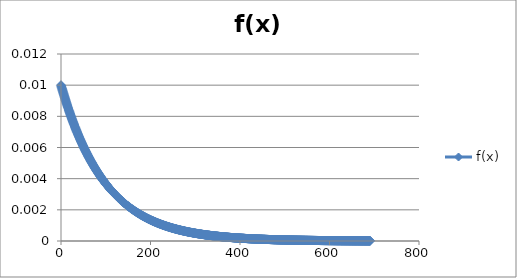
| Category | f(x) |
|---|---|
| 1e-10 | 0.01 |
| 0.6907755279981135 | 0.01 |
| 1.381551055896227 | 0.01 |
| 2.0723265837943403 | 0.01 |
| 2.763102111692454 | 0.01 |
| 3.4538776395905675 | 0.01 |
| 4.144653167488681 | 0.01 |
| 4.835428695386794 | 0.01 |
| 5.526204223284907 | 0.009 |
| 6.21697975118302 | 0.009 |
| 6.907755279081133 | 0.009 |
| 7.598530806979246 | 0.009 |
| 8.28930633487736 | 0.009 |
| 8.980081862775473 | 0.009 |
| 9.670857390673586 | 0.009 |
| 10.361632918571699 | 0.009 |
| 11.052408446469812 | 0.009 |
| 11.743183974367925 | 0.009 |
| 12.433959502266038 | 0.009 |
| 13.124735030164151 | 0.009 |
| 13.815510558062265 | 0.009 |
| 14.506286085960378 | 0.009 |
| 15.19706161385849 | 0.009 |
| 15.887837141756604 | 0.009 |
| 16.578612669654717 | 0.008 |
| 17.269388197552832 | 0.008 |
| 17.960163725450947 | 0.008 |
| 18.650939253349062 | 0.008 |
| 19.341714781247177 | 0.008 |
| 20.03249030914529 | 0.008 |
| 20.723265837043407 | 0.008 |
| 21.41404136494152 | 0.008 |
| 22.104816892839636 | 0.008 |
| 22.79559242073775 | 0.008 |
| 23.486367948635866 | 0.008 |
| 24.17714347653398 | 0.008 |
| 24.867919004432096 | 0.008 |
| 25.55869453233021 | 0.008 |
| 26.249470060228326 | 0.008 |
| 26.94024558812644 | 0.008 |
| 27.631021116024556 | 0.008 |
| 28.32179664392267 | 0.008 |
| 29.012572171820786 | 0.007 |
| 29.7033476997189 | 0.007 |
| 30.394123227617015 | 0.007 |
| 31.08489875551513 | 0.007 |
| 31.775674283413245 | 0.007 |
| 32.46644981131136 | 0.007 |
| 33.15722533920947 | 0.007 |
| 33.84800086710758 | 0.007 |
| 34.53877639500569 | 0.007 |
| 35.2295519229038 | 0.007 |
| 35.92032745080191 | 0.007 |
| 36.611102978700025 | 0.007 |
| 37.301878506598136 | 0.007 |
| 37.99265403449625 | 0.007 |
| 38.68342956239436 | 0.007 |
| 39.37420509029247 | 0.007 |
| 40.06498061819058 | 0.007 |
| 40.75575614608869 | 0.007 |
| 41.446531673986804 | 0.007 |
| 42.137307201884916 | 0.007 |
| 42.82808272978303 | 0.007 |
| 43.51885825768114 | 0.006 |
| 44.20963378557925 | 0.006 |
| 44.90040931347736 | 0.006 |
| 45.59118484137547 | 0.006 |
| 46.281960369273584 | 0.006 |
| 46.972735897171695 | 0.006 |
| 47.66351142506981 | 0.006 |
| 48.35428695296792 | 0.006 |
| 49.04506248086603 | 0.006 |
| 49.73583800876414 | 0.006 |
| 50.42661353666225 | 0.006 |
| 51.11738906456036 | 0.006 |
| 51.808164592458475 | 0.006 |
| 52.498940120356586 | 0.006 |
| 53.1897156482547 | 0.006 |
| 53.88049117615281 | 0.006 |
| 54.57126670405092 | 0.006 |
| 55.26204223194903 | 0.006 |
| 55.95281775984714 | 0.006 |
| 56.643593287745254 | 0.006 |
| 57.334368815643366 | 0.006 |
| 58.02514434354148 | 0.006 |
| 58.71591987143959 | 0.006 |
| 59.4066953993377 | 0.006 |
| 60.09747092723581 | 0.005 |
| 60.78824645513392 | 0.005 |
| 61.479021983032034 | 0.005 |
| 62.169797510930145 | 0.005 |
| 62.86057303882826 | 0.005 |
| 63.55134856672637 | 0.005 |
| 64.24212409462449 | 0.005 |
| 64.9328996225226 | 0.005 |
| 65.62367515042071 | 0.005 |
| 66.31445067831882 | 0.005 |
| 67.00522620621693 | 0.005 |
| 67.69600173411504 | 0.005 |
| 68.38677726201315 | 0.005 |
| 69.07755278991127 | 0.005 |
| 69.76832831780938 | 0.005 |
| 70.45910384570749 | 0.005 |
| 71.1498793736056 | 0.005 |
| 71.84065490150371 | 0.005 |
| 72.53143042940182 | 0.005 |
| 73.22220595729993 | 0.005 |
| 73.91298148519805 | 0.005 |
| 74.60375701309616 | 0.005 |
| 75.29453254099427 | 0.005 |
| 75.98530806889238 | 0.005 |
| 76.67608359679049 | 0.005 |
| 77.3668591246886 | 0.005 |
| 78.05763465258671 | 0.005 |
| 78.74841018048483 | 0.005 |
| 79.43918570838294 | 0.005 |
| 80.12996123628105 | 0.004 |
| 80.82073676417916 | 0.004 |
| 81.51151229207727 | 0.004 |
| 82.20228781997538 | 0.004 |
| 82.8930633478735 | 0.004 |
| 83.5838388757716 | 0.004 |
| 84.27461440366972 | 0.004 |
| 84.96538993156783 | 0.004 |
| 85.65616545946594 | 0.004 |
| 86.34694098736405 | 0.004 |
| 87.03771651526216 | 0.004 |
| 87.72849204316027 | 0.004 |
| 88.41926757105838 | 0.004 |
| 89.1100430989565 | 0.004 |
| 89.8008186268546 | 0.004 |
| 90.49159415475272 | 0.004 |
| 91.18236968265083 | 0.004 |
| 91.87314521054894 | 0.004 |
| 92.56392073844705 | 0.004 |
| 93.25469626634516 | 0.004 |
| 93.94547179424328 | 0.004 |
| 94.63624732214139 | 0.004 |
| 95.3270228500395 | 0.004 |
| 96.01779837793761 | 0.004 |
| 96.70857390583572 | 0.004 |
| 97.39934943373383 | 0.004 |
| 98.09012496163194 | 0.004 |
| 98.78090048953005 | 0.004 |
| 99.47167601742817 | 0.004 |
| 100.16245154532628 | 0.004 |
| 100.85322707322439 | 0.004 |
| 101.5440026011225 | 0.004 |
| 102.23477812902061 | 0.004 |
| 102.92555365691872 | 0.004 |
| 103.61632918481683 | 0.004 |
| 104.30710471271495 | 0.004 |
| 104.99788024061306 | 0.003 |
| 105.68865576851117 | 0.003 |
| 106.37943129640928 | 0.003 |
| 107.07020682430739 | 0.003 |
| 107.7609823522055 | 0.003 |
| 108.45175788010361 | 0.003 |
| 109.14253340800173 | 0.003 |
| 109.83330893589984 | 0.003 |
| 110.52408446379795 | 0.003 |
| 111.21485999169606 | 0.003 |
| 111.90563551959417 | 0.003 |
| 112.59641104749228 | 0.003 |
| 113.2871865753904 | 0.003 |
| 113.9779621032885 | 0.003 |
| 114.66873763118662 | 0.003 |
| 115.35951315908473 | 0.003 |
| 116.05028868698284 | 0.003 |
| 116.74106421488095 | 0.003 |
| 117.43183974277906 | 0.003 |
| 118.12261527067717 | 0.003 |
| 118.81339079857528 | 0.003 |
| 119.5041663264734 | 0.003 |
| 120.1949418543715 | 0.003 |
| 120.88571738226962 | 0.003 |
| 121.57649291016773 | 0.003 |
| 122.26726843806584 | 0.003 |
| 122.95804396596395 | 0.003 |
| 123.64881949386206 | 0.003 |
| 124.33959502176018 | 0.003 |
| 125.03037054965829 | 0.003 |
| 125.7211460775564 | 0.003 |
| 126.41192160545451 | 0.003 |
| 127.10269713335262 | 0.003 |
| 127.79347266125073 | 0.003 |
| 128.48424818914884 | 0.003 |
| 129.17502371704697 | 0.003 |
| 129.8657992449451 | 0.003 |
| 130.55657477284322 | 0.003 |
| 131.24735030074135 | 0.003 |
| 131.93812582863947 | 0.003 |
| 132.6289013565376 | 0.003 |
| 133.31967688443572 | 0.003 |
| 134.01045241233385 | 0.003 |
| 134.70122794023197 | 0.003 |
| 135.3920034681301 | 0.003 |
| 136.08277899602822 | 0.003 |
| 136.77355452392635 | 0.003 |
| 137.46433005182448 | 0.003 |
| 138.1551055797226 | 0.003 |
| 138.84588110762073 | 0.002 |
| 139.53665663551885 | 0.002 |
| 140.22743216341698 | 0.002 |
| 140.9182076913151 | 0.002 |
| 141.60898321921323 | 0.002 |
| 142.29975874711135 | 0.002 |
| 142.99053427500948 | 0.002 |
| 143.6813098029076 | 0.002 |
| 144.37208533080573 | 0.002 |
| 145.06286085870386 | 0.002 |
| 145.75363638660198 | 0.002 |
| 146.4444119145001 | 0.002 |
| 147.13518744239823 | 0.002 |
| 147.82596297029636 | 0.002 |
| 148.51673849819448 | 0.002 |
| 149.2075140260926 | 0.002 |
| 149.89828955399074 | 0.002 |
| 150.58906508188886 | 0.002 |
| 151.279840609787 | 0.002 |
| 151.9706161376851 | 0.002 |
| 152.66139166558324 | 0.002 |
| 153.35216719348136 | 0.002 |
| 154.0429427213795 | 0.002 |
| 154.73371824927762 | 0.002 |
| 155.42449377717574 | 0.002 |
| 156.11526930507387 | 0.002 |
| 156.806044832972 | 0.002 |
| 157.49682036087012 | 0.002 |
| 158.18759588876824 | 0.002 |
| 158.87837141666637 | 0.002 |
| 159.5691469445645 | 0.002 |
| 160.25992247246262 | 0.002 |
| 160.95069800036075 | 0.002 |
| 161.64147352825887 | 0.002 |
| 162.332249056157 | 0.002 |
| 163.02302458405512 | 0.002 |
| 163.71380011195325 | 0.002 |
| 164.40457563985137 | 0.002 |
| 165.0953511677495 | 0.002 |
| 165.78612669564762 | 0.002 |
| 166.47690222354575 | 0.002 |
| 167.16767775144388 | 0.002 |
| 167.858453279342 | 0.002 |
| 168.54922880724013 | 0.002 |
| 169.24000433513825 | 0.002 |
| 169.93077986303638 | 0.002 |
| 170.6215553909345 | 0.002 |
| 171.31233091883263 | 0.002 |
| 172.00310644673075 | 0.002 |
| 172.69388197462888 | 0.002 |
| 173.384657502527 | 0.002 |
| 174.07543303042513 | 0.002 |
| 174.76620855832326 | 0.002 |
| 175.45698408622138 | 0.002 |
| 176.1477596141195 | 0.002 |
| 176.83853514201763 | 0.002 |
| 177.52931066991576 | 0.002 |
| 178.22008619781388 | 0.002 |
| 178.910861725712 | 0.002 |
| 179.60163725361014 | 0.002 |
| 180.29241278150826 | 0.002 |
| 180.9831883094064 | 0.002 |
| 181.6739638373045 | 0.002 |
| 182.36473936520264 | 0.002 |
| 183.05551489310076 | 0.002 |
| 183.7462904209989 | 0.002 |
| 184.43706594889701 | 0.002 |
| 185.12784147679514 | 0.002 |
| 185.81861700469327 | 0.002 |
| 186.5093925325914 | 0.002 |
| 187.20016806048952 | 0.002 |
| 187.89094358838764 | 0.002 |
| 188.58171911628577 | 0.002 |
| 189.2724946441839 | 0.002 |
| 189.96327017208202 | 0.001 |
| 190.65404569998014 | 0.001 |
| 191.34482122787827 | 0.001 |
| 192.0355967557764 | 0.001 |
| 192.72637228367452 | 0.001 |
| 193.41714781157265 | 0.001 |
| 194.10792333947077 | 0.001 |
| 194.7986988673689 | 0.001 |
| 195.48947439526702 | 0.001 |
| 196.18024992316515 | 0.001 |
| 196.87102545106328 | 0.001 |
| 197.5618009789614 | 0.001 |
| 198.25257650685953 | 0.001 |
| 198.94335203475765 | 0.001 |
| 199.63412756265578 | 0.001 |
| 200.3249030905539 | 0.001 |
| 201.01567861845203 | 0.001 |
| 201.70645414635015 | 0.001 |
| 202.39722967424828 | 0.001 |
| 203.0880052021464 | 0.001 |
| 203.77878073004453 | 0.001 |
| 204.46955625794266 | 0.001 |
| 205.16033178584078 | 0.001 |
| 205.8511073137389 | 0.001 |
| 206.54188284163703 | 0.001 |
| 207.23265836953516 | 0.001 |
| 207.92343389743328 | 0.001 |
| 208.6142094253314 | 0.001 |
| 209.30498495322954 | 0.001 |
| 209.99576048112766 | 0.001 |
| 210.6865360090258 | 0.001 |
| 211.3773115369239 | 0.001 |
| 212.06808706482204 | 0.001 |
| 212.75886259272016 | 0.001 |
| 213.4496381206183 | 0.001 |
| 214.14041364851641 | 0.001 |
| 214.83118917641454 | 0.001 |
| 215.52196470431267 | 0.001 |
| 216.2127402322108 | 0.001 |
| 216.90351576010892 | 0.001 |
| 217.59429128800704 | 0.001 |
| 218.28506681590517 | 0.001 |
| 218.9758423438033 | 0.001 |
| 219.66661787170142 | 0.001 |
| 220.35739339959954 | 0.001 |
| 221.04816892749767 | 0.001 |
| 221.7389444553958 | 0.001 |
| 222.42971998329392 | 0.001 |
| 223.12049551119205 | 0.001 |
| 223.81127103909017 | 0.001 |
| 224.5020465669883 | 0.001 |
| 225.19282209488642 | 0.001 |
| 225.88359762278455 | 0.001 |
| 226.57437315068267 | 0.001 |
| 227.2651486785808 | 0.001 |
| 227.95592420647893 | 0.001 |
| 228.64669973437705 | 0.001 |
| 229.33747526227518 | 0.001 |
| 230.0282507901733 | 0.001 |
| 230.71902631807143 | 0.001 |
| 231.40980184596955 | 0.001 |
| 232.10057737386768 | 0.001 |
| 232.7913529017658 | 0.001 |
| 233.48212842966393 | 0.001 |
| 234.17290395756206 | 0.001 |
| 234.86367948546018 | 0.001 |
| 235.5544550133583 | 0.001 |
| 236.24523054125643 | 0.001 |
| 236.93600606915456 | 0.001 |
| 237.62678159705268 | 0.001 |
| 238.3175571249508 | 0.001 |
| 239.00833265284894 | 0.001 |
| 239.69910818074706 | 0.001 |
| 240.3898837086452 | 0.001 |
| 241.0806592365433 | 0.001 |
| 241.77143476444144 | 0.001 |
| 242.46221029233956 | 0.001 |
| 243.1529858202377 | 0.001 |
| 243.8437613481358 | 0.001 |
| 244.53453687603394 | 0.001 |
| 245.22531240393207 | 0.001 |
| 245.9160879318302 | 0.001 |
| 246.60686345972832 | 0.001 |
| 247.29763898762644 | 0.001 |
| 247.98841451552457 | 0.001 |
| 248.6791900434227 | 0.001 |
| 249.36996557132082 | 0.001 |
| 250.06074109921894 | 0.001 |
| 250.75151662711707 | 0.001 |
| 251.4422921550152 | 0.001 |
| 252.13306768291332 | 0.001 |
| 252.82384321081145 | 0.001 |
| 253.51461873870957 | 0.001 |
| 254.2053942666077 | 0.001 |
| 254.89616979450582 | 0.001 |
| 255.58694532240395 | 0.001 |
| 256.27772085030205 | 0.001 |
| 256.96849637820014 | 0.001 |
| 257.65927190609824 | 0.001 |
| 258.35004743399634 | 0.001 |
| 259.04082296189443 | 0.001 |
| 259.73159848979253 | 0.001 |
| 260.42237401769063 | 0.001 |
| 261.1131495455887 | 0.001 |
| 261.8039250734868 | 0.001 |
| 262.4947006013849 | 0.001 |
| 263.185476129283 | 0.001 |
| 263.8762516571811 | 0.001 |
| 264.5670271850792 | 0.001 |
| 265.2578027129773 | 0.001 |
| 265.9485782408754 | 0.001 |
| 266.6393537687735 | 0.001 |
| 267.3301292966716 | 0.001 |
| 268.0209048245697 | 0.001 |
| 268.7116803524678 | 0.001 |
| 269.4024558803659 | 0.001 |
| 270.093231408264 | 0.001 |
| 270.7840069361621 | 0.001 |
| 271.4747824640602 | 0.001 |
| 272.1655579919583 | 0.001 |
| 272.8563335198564 | 0.001 |
| 273.5471090477545 | 0.001 |
| 274.2378845756526 | 0.001 |
| 274.92866010355067 | 0.001 |
| 275.61943563144877 | 0.001 |
| 276.31021115934686 | 0.001 |
| 277.00098668724496 | 0.001 |
| 277.69176221514306 | 0.001 |
| 278.38253774304115 | 0.001 |
| 279.07331327093925 | 0.001 |
| 279.76408879883735 | 0.001 |
| 280.45486432673545 | 0.001 |
| 281.14563985463354 | 0.001 |
| 281.83641538253164 | 0.001 |
| 282.52719091042974 | 0.001 |
| 283.21796643832784 | 0.001 |
| 283.90874196622593 | 0.001 |
| 284.59951749412403 | 0.001 |
| 285.2902930220221 | 0.001 |
| 285.9810685499202 | 0.001 |
| 286.6718440778183 | 0.001 |
| 287.3626196057164 | 0.001 |
| 288.0533951336145 | 0.001 |
| 288.7441706615126 | 0.001 |
| 289.4349461894107 | 0.001 |
| 290.1257217173088 | 0.001 |
| 290.8164972452069 | 0.001 |
| 291.507272773105 | 0.001 |
| 292.1980483010031 | 0.001 |
| 292.8888238289012 | 0.001 |
| 293.5795993567993 | 0.001 |
| 294.2703748846974 | 0.001 |
| 294.9611504125955 | 0.001 |
| 295.6519259404936 | 0.001 |
| 296.3427014683917 | 0.001 |
| 297.0334769962898 | 0.001 |
| 297.7242525241879 | 0.001 |
| 298.415028052086 | 0.001 |
| 299.10580357998407 | 0.001 |
| 299.79657910788217 | 0 |
| 300.48735463578026 | 0 |
| 301.17813016367836 | 0 |
| 301.86890569157646 | 0 |
| 302.55968121947456 | 0 |
| 303.25045674737265 | 0 |
| 303.94123227527075 | 0 |
| 304.63200780316885 | 0 |
| 305.32278333106694 | 0 |
| 306.01355885896504 | 0 |
| 306.70433438686314 | 0 |
| 307.39510991476124 | 0 |
| 308.08588544265933 | 0 |
| 308.77666097055743 | 0 |
| 309.4674364984555 | 0 |
| 310.1582120263536 | 0 |
| 310.8489875542517 | 0 |
| 311.5397630821498 | 0 |
| 312.2305386100479 | 0 |
| 312.921314137946 | 0 |
| 313.6120896658441 | 0 |
| 314.3028651937422 | 0 |
| 314.9936407216403 | 0 |
| 315.6844162495384 | 0 |
| 316.3751917774365 | 0 |
| 317.0659673053346 | 0 |
| 317.7567428332327 | 0 |
| 318.4475183611308 | 0 |
| 319.1382938890289 | 0 |
| 319.829069416927 | 0 |
| 320.5198449448251 | 0 |
| 321.2106204727232 | 0 |
| 321.9013960006213 | 0 |
| 322.5921715285194 | 0 |
| 323.28294705641747 | 0 |
| 323.97372258431557 | 0 |
| 324.66449811221366 | 0 |
| 325.35527364011176 | 0 |
| 326.04604916800986 | 0 |
| 326.73682469590796 | 0 |
| 327.42760022380605 | 0 |
| 328.11837575170415 | 0 |
| 328.80915127960225 | 0 |
| 329.49992680750034 | 0 |
| 330.19070233539844 | 0 |
| 330.88147786329654 | 0 |
| 331.57225339119464 | 0 |
| 332.26302891909273 | 0 |
| 332.95380444699083 | 0 |
| 333.6445799748889 | 0 |
| 334.335355502787 | 0 |
| 335.0261310306851 | 0 |
| 335.7169065585832 | 0 |
| 336.4076820864813 | 0 |
| 337.0984576143794 | 0 |
| 337.7892331422775 | 0 |
| 338.4800086701756 | 0 |
| 339.1707841980737 | 0 |
| 339.8615597259718 | 0 |
| 340.5523352538699 | 0 |
| 341.243110781768 | 0 |
| 341.9338863096661 | 0 |
| 342.6246618375642 | 0 |
| 343.3154373654623 | 0 |
| 344.0062128933604 | 0 |
| 344.6969884212585 | 0 |
| 345.3877639491566 | 0 |
| 346.0785394770547 | 0 |
| 346.7693150049528 | 0 |
| 347.46009053285087 | 0 |
| 348.15086606074897 | 0 |
| 348.84164158864706 | 0 |
| 349.53241711654516 | 0 |
| 350.22319264444326 | 0 |
| 350.91396817234136 | 0 |
| 351.60474370023945 | 0 |
| 352.29551922813755 | 0 |
| 352.98629475603565 | 0 |
| 353.67707028393374 | 0 |
| 354.36784581183184 | 0 |
| 355.05862133972994 | 0 |
| 355.74939686762804 | 0 |
| 356.44017239552613 | 0 |
| 357.13094792342423 | 0 |
| 357.8217234513223 | 0 |
| 358.5124989792204 | 0 |
| 359.2032745071185 | 0 |
| 359.8940500350166 | 0 |
| 360.5848255629147 | 0 |
| 361.2756010908128 | 0 |
| 361.9663766187109 | 0 |
| 362.657152146609 | 0 |
| 363.3479276745071 | 0 |
| 364.0387032024052 | 0 |
| 364.7294787303033 | 0 |
| 365.4202542582014 | 0 |
| 366.1110297860995 | 0 |
| 366.8018053139976 | 0 |
| 367.4925808418957 | 0 |
| 368.1833563697938 | 0 |
| 368.8741318976919 | 0 |
| 369.56490742559 | 0 |
| 370.2556829534881 | 0 |
| 370.9464584813862 | 0 |
| 371.63723400928427 | 0 |
| 372.32800953718237 | 0 |
| 373.01878506508046 | 0 |
| 373.70956059297856 | 0 |
| 374.40033612087666 | 0 |
| 375.09111164877476 | 0 |
| 375.78188717667285 | 0 |
| 376.47266270457095 | 0 |
| 377.16343823246905 | 0 |
| 377.85421376036714 | 0 |
| 378.54498928826524 | 0 |
| 379.23576481616334 | 0 |
| 379.92654034406144 | 0 |
| 380.61731587195953 | 0 |
| 381.30809139985763 | 0 |
| 381.9988669277557 | 0 |
| 382.6896424556538 | 0 |
| 383.3804179835519 | 0 |
| 384.07119351145 | 0 |
| 384.7619690393481 | 0 |
| 385.4527445672462 | 0 |
| 386.1435200951443 | 0 |
| 386.8342956230424 | 0 |
| 387.5250711509405 | 0 |
| 388.2158466788386 | 0 |
| 388.9066222067367 | 0 |
| 389.5973977346348 | 0 |
| 390.2881732625329 | 0 |
| 390.978948790431 | 0 |
| 391.6697243183291 | 0 |
| 392.3604998462272 | 0 |
| 393.0512753741253 | 0 |
| 393.7420509020234 | 0 |
| 394.4328264299215 | 0 |
| 395.1236019578196 | 0 |
| 395.81437748571767 | 0 |
| 396.50515301361577 | 0 |
| 397.19592854151387 | 0 |
| 397.88670406941196 | 0 |
| 398.57747959731006 | 0 |
| 399.26825512520816 | 0 |
| 399.95903065310625 | 0 |
| 400.64980618100435 | 0 |
| 401.34058170890245 | 0 |
| 402.03135723680055 | 0 |
| 402.72213276469864 | 0 |
| 403.41290829259674 | 0 |
| 404.10368382049484 | 0 |
| 404.79445934839293 | 0 |
| 405.48523487629103 | 0 |
| 406.1760104041891 | 0 |
| 406.8667859320872 | 0 |
| 407.5575614599853 | 0 |
| 408.2483369878834 | 0 |
| 408.9391125157815 | 0 |
| 409.6298880436796 | 0 |
| 410.3206635715777 | 0 |
| 411.0114390994758 | 0 |
| 411.7022146273739 | 0 |
| 412.392990155272 | 0 |
| 413.0837656831701 | 0 |
| 413.7745412110682 | 0 |
| 414.4653167389663 | 0 |
| 415.1560922668644 | 0 |
| 415.8468677947625 | 0 |
| 416.5376433226606 | 0 |
| 417.2284188505587 | 0 |
| 417.9191943784568 | 0 |
| 418.6099699063549 | 0 |
| 419.300745434253 | 0 |
| 419.99152096215107 | 0 |
| 420.68229649004917 | 0 |
| 421.37307201794727 | 0 |
| 422.06384754584536 | 0 |
| 422.75462307374346 | 0 |
| 423.44539860164156 | 0 |
| 424.13617412953965 | 0 |
| 424.82694965743775 | 0 |
| 425.51772518533585 | 0 |
| 426.20850071323395 | 0 |
| 426.89927624113204 | 0 |
| 427.59005176903014 | 0 |
| 428.28082729692824 | 0 |
| 428.97160282482633 | 0 |
| 429.66237835272443 | 0 |
| 430.35315388062253 | 0 |
| 431.0439294085206 | 0 |
| 431.7347049364187 | 0 |
| 432.4254804643168 | 0 |
| 433.1162559922149 | 0 |
| 433.807031520113 | 0 |
| 434.4978070480111 | 0 |
| 435.1885825759092 | 0 |
| 435.8793581038073 | 0 |
| 436.5701336317054 | 0 |
| 437.2609091596035 | 0 |
| 437.9516846875016 | 0 |
| 438.6424602153997 | 0 |
| 439.3332357432978 | 0 |
| 440.0240112711959 | 0 |
| 440.714786799094 | 0 |
| 441.4055623269921 | 0 |
| 442.0963378548902 | 0 |
| 442.7871133827883 | 0 |
| 443.4778889106864 | 0 |
| 444.16866443858447 | 0 |
| 444.85943996648257 | 0 |
| 445.55021549438067 | 0 |
| 446.24099102227876 | 0 |
| 446.93176655017686 | 0 |
| 447.62254207807496 | 0 |
| 448.31331760597305 | 0 |
| 449.00409313387115 | 0 |
| 449.69486866176925 | 0 |
| 450.38564418966735 | 0 |
| 451.07641971756544 | 0 |
| 451.76719524546354 | 0 |
| 452.45797077336164 | 0 |
| 453.14874630125973 | 0 |
| 453.83952182915783 | 0 |
| 454.53029735705593 | 0 |
| 455.221072884954 | 0 |
| 455.9118484128521 | 0 |
| 456.6026239407502 | 0 |
| 457.2933994686483 | 0 |
| 457.9841749965464 | 0 |
| 458.6749505244445 | 0 |
| 459.3657260523426 | 0 |
| 460.0565015802407 | 0 |
| 460.7472771081388 | 0 |
| 461.4380526360369 | 0 |
| 462.128828163935 | 0 |
| 462.8196036918331 | 0 |
| 463.5103792197312 | 0 |
| 464.2011547476293 | 0 |
| 464.8919302755274 | 0 |
| 465.5827058034255 | 0 |
| 466.2734813313236 | 0 |
| 466.9642568592217 | 0 |
| 467.6550323871198 | 0 |
| 468.3458079150179 | 0 |
| 469.03658344291597 | 0 |
| 469.72735897081407 | 0 |
| 470.41813449871216 | 0 |
| 471.10891002661026 | 0 |
| 471.79968555450836 | 0 |
| 472.49046108240645 | 0 |
| 473.18123661030455 | 0 |
| 473.87201213820265 | 0 |
| 474.56278766610075 | 0 |
| 475.25356319399884 | 0 |
| 475.94433872189694 | 0 |
| 476.63511424979504 | 0 |
| 477.32588977769313 | 0 |
| 478.01666530559123 | 0 |
| 478.70744083348933 | 0 |
| 479.3982163613874 | 0 |
| 480.0889918892855 | 0 |
| 480.7797674171836 | 0 |
| 481.4705429450817 | 0 |
| 482.1613184729798 | 0 |
| 482.8520940008779 | 0 |
| 483.542869528776 | 0 |
| 484.2336450566741 | 0 |
| 484.9244205845722 | 0 |
| 485.6151961124703 | 0 |
| 486.3059716403684 | 0 |
| 486.9967471682665 | 0 |
| 487.6875226961646 | 0 |
| 488.3782982240627 | 0 |
| 489.0690737519608 | 0 |
| 489.7598492798589 | 0 |
| 490.450624807757 | 0 |
| 491.1414003356551 | 0 |
| 491.8321758635532 | 0 |
| 492.5229513914513 | 0 |
| 493.21372691934937 | 0 |
| 493.90450244724747 | 0 |
| 494.59527797514556 | 0 |
| 495.28605350304366 | 0 |
| 495.97682903094176 | 0 |
| 496.66760455883986 | 0 |
| 497.35838008673795 | 0 |
| 498.04915561463605 | 0 |
| 498.73993114253415 | 0 |
| 499.43070667043224 | 0 |
| 500.12148219833034 | 0 |
| 500.81225772622844 | 0 |
| 501.50303325412654 | 0 |
| 502.19380878202463 | 0 |
| 502.88458430992273 | 0 |
| 503.5753598378208 | 0 |
| 504.2661353657189 | 0 |
| 504.956910893617 | 0 |
| 505.6476864215151 | 0 |
| 506.3384619494132 | 0 |
| 507.0292374773113 | 0 |
| 507.7200130052094 | 0 |
| 508.4107885331075 | 0 |
| 509.1015640610056 | 0 |
| 509.7923395889037 | 0 |
| 510.4831151168018 | 0 |
| 511.1738906446999 | 0 |
| 511.864666172598 | 0 |
| 512.5554417004961 | 0 |
| 513.2462172283942 | 0 |
| 513.9369927562924 | 0 |
| 514.6277682841906 | 0 |
| 515.3185438120887 | 0 |
| 516.0093193399869 | 0 |
| 516.700094867885 | 0 |
| 517.3908703957832 | 0 |
| 518.0816459236813 | 0 |
| 518.7724214515795 | 0 |
| 519.4631969794776 | 0 |
| 520.1539725073758 | 0 |
| 520.8447480352739 | 0 |
| 521.5355235631721 | 0 |
| 522.2262990910702 | 0 |
| 522.9170746189684 | 0 |
| 523.6078501468666 | 0 |
| 524.2986256747647 | 0 |
| 524.9894012026629 | 0 |
| 525.680176730561 | 0 |
| 526.3709522584592 | 0 |
| 527.0617277863573 | 0 |
| 527.7525033142555 | 0 |
| 528.4432788421536 | 0 |
| 529.1340543700518 | 0 |
| 529.8248298979499 | 0 |
| 530.5156054258481 | 0 |
| 531.2063809537462 | 0 |
| 531.8971564816444 | 0 |
| 532.5879320095426 | 0 |
| 533.2787075374407 | 0 |
| 533.9694830653389 | 0 |
| 534.660258593237 | 0 |
| 535.3510341211352 | 0 |
| 536.0418096490333 | 0 |
| 536.7325851769315 | 0 |
| 537.4233607048296 | 0 |
| 538.1141362327278 | 0 |
| 538.8049117606259 | 0 |
| 539.4956872885241 | 0 |
| 540.1864628164222 | 0 |
| 540.8772383443204 | 0 |
| 541.5680138722186 | 0 |
| 542.2587894001167 | 0 |
| 542.9495649280149 | 0 |
| 543.640340455913 | 0 |
| 544.3311159838112 | 0 |
| 545.0218915117093 | 0 |
| 545.7126670396075 | 0 |
| 546.4034425675056 | 0 |
| 547.0942180954038 | 0 |
| 547.784993623302 | 0 |
| 548.4757691512001 | 0 |
| 549.1665446790983 | 0 |
| 549.8573202069964 | 0 |
| 550.5480957348946 | 0 |
| 551.2388712627927 | 0 |
| 551.9296467906909 | 0 |
| 552.620422318589 | 0 |
| 553.3111978464872 | 0 |
| 554.0019733743853 | 0 |
| 554.6927489022835 | 0 |
| 555.3835244301816 | 0 |
| 556.0742999580798 | 0 |
| 556.765075485978 | 0 |
| 557.4558510138761 | 0 |
| 558.1466265417743 | 0 |
| 558.8374020696724 | 0 |
| 559.5281775975706 | 0 |
| 560.2189531254687 | 0 |
| 560.9097286533669 | 0 |
| 561.600504181265 | 0 |
| 562.2912797091632 | 0 |
| 562.9820552370613 | 0 |
| 563.6728307649595 | 0 |
| 564.3636062928576 | 0 |
| 565.0543818207558 | 0 |
| 565.745157348654 | 0 |
| 566.4359328765521 | 0 |
| 567.1267084044503 | 0 |
| 567.8174839323484 | 0 |
| 568.5082594602466 | 0 |
| 569.1990349881447 | 0 |
| 569.8898105160429 | 0 |
| 570.580586043941 | 0 |
| 571.2713615718392 | 0 |
| 571.9621370997373 | 0 |
| 572.6529126276355 | 0 |
| 573.3436881555336 | 0 |
| 574.0344636834318 | 0 |
| 574.72523921133 | 0 |
| 575.4160147392281 | 0 |
| 576.1067902671263 | 0 |
| 576.7975657950244 | 0 |
| 577.4883413229226 | 0 |
| 578.1791168508207 | 0 |
| 578.8698923787189 | 0 |
| 579.560667906617 | 0 |
| 580.2514434345152 | 0 |
| 580.9422189624133 | 0 |
| 581.6329944903115 | 0 |
| 582.3237700182096 | 0 |
| 583.0145455461078 | 0 |
| 583.705321074006 | 0 |
| 584.3960966019041 | 0 |
| 585.0868721298023 | 0 |
| 585.7776476577004 | 0 |
| 586.4684231855986 | 0 |
| 587.1591987134967 | 0 |
| 587.8499742413949 | 0 |
| 588.540749769293 | 0 |
| 589.2315252971912 | 0 |
| 589.9223008250893 | 0 |
| 590.6130763529875 | 0 |
| 591.3038518808856 | 0 |
| 591.9946274087838 | 0 |
| 592.685402936682 | 0 |
| 593.3761784645801 | 0 |
| 594.0669539924783 | 0 |
| 594.7577295203764 | 0 |
| 595.4485050482746 | 0 |
| 596.1392805761727 | 0 |
| 596.8300561040709 | 0 |
| 597.520831631969 | 0 |
| 598.2116071598672 | 0 |
| 598.9023826877653 | 0 |
| 599.5931582156635 | 0 |
| 600.2839337435616 | 0 |
| 600.9747092714598 | 0 |
| 601.665484799358 | 0 |
| 602.3562603272561 | 0 |
| 603.0470358551543 | 0 |
| 603.7378113830524 | 0 |
| 604.4285869109506 | 0 |
| 605.1193624388487 | 0 |
| 605.8101379667469 | 0 |
| 606.500913494645 | 0 |
| 607.1916890225432 | 0 |
| 607.8824645504413 | 0 |
| 608.5732400783395 | 0 |
| 609.2640156062376 | 0 |
| 609.9547911341358 | 0 |
| 610.645566662034 | 0 |
| 611.3363421899321 | 0 |
| 612.0271177178303 | 0 |
| 612.7178932457284 | 0 |
| 613.4086687736266 | 0 |
| 614.0994443015247 | 0 |
| 614.7902198294229 | 0 |
| 615.480995357321 | 0 |
| 616.1717708852192 | 0 |
| 616.8625464131173 | 0 |
| 617.5533219410155 | 0 |
| 618.2440974689137 | 0 |
| 618.9348729968118 | 0 |
| 619.62564852471 | 0 |
| 620.3164240526081 | 0 |
| 621.0071995805063 | 0 |
| 621.6979751084044 | 0 |
| 622.3887506363026 | 0 |
| 623.0795261642007 | 0 |
| 623.7703016920989 | 0 |
| 624.461077219997 | 0 |
| 625.1518527478952 | 0 |
| 625.8426282757933 | 0 |
| 626.5334038036915 | 0 |
| 627.2241793315897 | 0 |
| 627.9149548594878 | 0 |
| 628.605730387386 | 0 |
| 629.2965059152841 | 0 |
| 629.9872814431823 | 0 |
| 630.6780569710804 | 0 |
| 631.3688324989786 | 0 |
| 632.0596080268767 | 0 |
| 632.7503835547749 | 0 |
| 633.441159082673 | 0 |
| 634.1319346105712 | 0 |
| 634.8227101384693 | 0 |
| 635.5134856663675 | 0 |
| 636.2042611942657 | 0 |
| 636.8950367221638 | 0 |
| 637.585812250062 | 0 |
| 638.2765877779601 | 0 |
| 638.9673633058583 | 0 |
| 639.6581388337564 | 0 |
| 640.3489143616546 | 0 |
| 641.0396898895527 | 0 |
| 641.7304654174509 | 0 |
| 642.421240945349 | 0 |
| 643.1120164732472 | 0 |
| 643.8027920011453 | 0 |
| 644.4935675290435 | 0 |
| 645.1843430569417 | 0 |
| 645.8751185848398 | 0 |
| 646.565894112738 | 0 |
| 647.2566696406361 | 0 |
| 647.9474451685343 | 0 |
| 648.6382206964324 | 0 |
| 649.3289962243306 | 0 |
| 650.0197717522287 | 0 |
| 650.7105472801269 | 0 |
| 651.401322808025 | 0 |
| 652.0920983359232 | 0 |
| 652.7828738638214 | 0 |
| 653.4736493917195 | 0 |
| 654.1644249196177 | 0 |
| 654.8552004475158 | 0 |
| 655.545975975414 | 0 |
| 656.2367515033121 | 0 |
| 656.9275270312103 | 0 |
| 657.6183025591084 | 0 |
| 658.3090780870066 | 0 |
| 658.9998536149047 | 0 |
| 659.6906291428029 | 0 |
| 660.381404670701 | 0 |
| 661.0721801985992 | 0 |
| 661.7629557264974 | 0 |
| 662.4537312543955 | 0 |
| 663.1445067822937 | 0 |
| 663.8352823101918 | 0 |
| 664.52605783809 | 0 |
| 665.2168333659881 | 0 |
| 665.9076088938863 | 0 |
| 666.5983844217844 | 0 |
| 667.2891599496826 | 0 |
| 667.9799354775807 | 0 |
| 668.6707110054789 | 0 |
| 669.361486533377 | 0 |
| 670.0522620612752 | 0 |
| 670.7430375891734 | 0 |
| 671.4338131170715 | 0 |
| 672.1245886449697 | 0 |
| 672.8153641728678 | 0 |
| 673.506139700766 | 0 |
| 674.1969152286641 | 0 |
| 674.8876907565623 | 0 |
| 675.5784662844604 | 0 |
| 676.2692418123586 | 0 |
| 676.9600173402567 | 0 |
| 677.6507928681549 | 0 |
| 678.341568396053 | 0 |
| 679.0323439239512 | 0 |
| 679.7231194518494 | 0 |
| 680.4138949797475 | 0 |
| 681.1046705076457 | 0 |
| 681.7954460355438 | 0 |
| 682.486221563442 | 0 |
| 683.1769970913401 | 0 |
| 683.8677726192383 | 0 |
| 684.5585481471364 | 0 |
| 685.2493236750346 | 0 |
| 685.9400992029327 | 0 |
| 686.6308747308309 | 0 |
| 687.321650258729 | 0 |
| 688.0124257866272 | 0 |
| 688.7032013145254 | 0 |
| 689.3939768424235 | 0 |
| 690.0847523703217 | 0 |
| 690.7755278982136 | 0 |